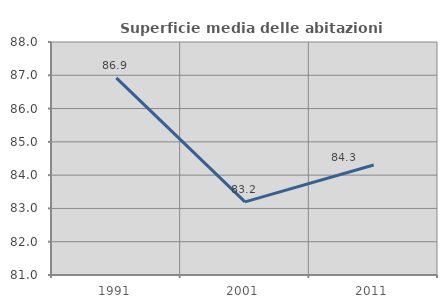
| Category | Superficie media delle abitazioni occupate |
|---|---|
| 1991.0 | 86.924 |
| 2001.0 | 83.198 |
| 2011.0 | 84.304 |